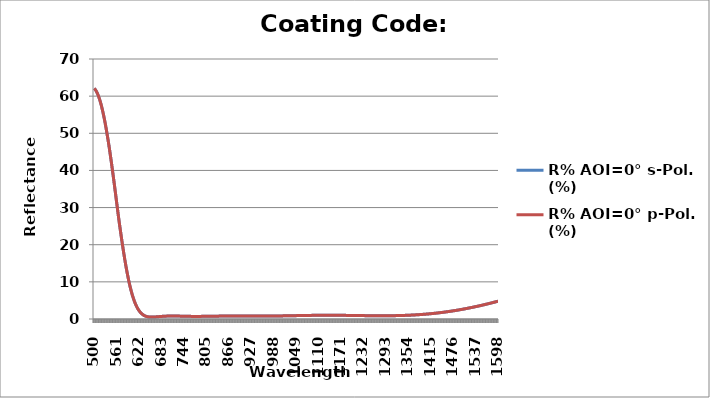
| Category | R% AOI=0° s-Pol. (%) | R% AOI=0° p-Pol. (%) |
|---|---|---|
| 500.0 | 62.076 | 62.076 |
| 501.0 | 61.985 | 61.985 |
| 502.0 | 61.878 | 61.878 |
| 503.0 | 61.754 | 61.754 |
| 504.0 | 61.613 | 61.613 |
| 505.0 | 61.457 | 61.457 |
| 506.0 | 61.284 | 61.284 |
| 507.0 | 61.096 | 61.096 |
| 508.0 | 60.893 | 60.893 |
| 509.0 | 60.674 | 60.674 |
| 510.0 | 60.44 | 60.44 |
| 511.0 | 60.19 | 60.19 |
| 512.0 | 59.926 | 59.926 |
| 513.0 | 59.647 | 59.647 |
| 514.0 | 59.353 | 59.353 |
| 515.0 | 59.044 | 59.044 |
| 516.0 | 58.72 | 58.72 |
| 517.0 | 58.379 | 58.379 |
| 518.0 | 58.023 | 58.023 |
| 519.0 | 57.653 | 57.653 |
| 520.0 | 57.268 | 57.268 |
| 521.0 | 56.869 | 56.869 |
| 522.0 | 56.456 | 56.456 |
| 523.0 | 56.029 | 56.029 |
| 524.0 | 55.587 | 55.587 |
| 525.0 | 55.132 | 55.132 |
| 526.0 | 54.663 | 54.663 |
| 527.0 | 54.18 | 54.18 |
| 528.0 | 53.684 | 53.684 |
| 529.0 | 53.175 | 53.175 |
| 530.0 | 52.652 | 52.652 |
| 531.0 | 52.116 | 52.116 |
| 532.0 | 51.566 | 51.566 |
| 533.0 | 51.005 | 51.005 |
| 534.0 | 50.43 | 50.43 |
| 535.0 | 49.843 | 49.843 |
| 536.0 | 49.244 | 49.244 |
| 537.0 | 48.638 | 48.638 |
| 538.0 | 48.02 | 48.02 |
| 539.0 | 47.392 | 47.392 |
| 540.0 | 46.752 | 46.752 |
| 541.0 | 46.101 | 46.101 |
| 542.0 | 45.44 | 45.44 |
| 543.0 | 44.768 | 44.768 |
| 544.0 | 44.087 | 44.087 |
| 545.0 | 43.397 | 43.397 |
| 546.0 | 42.697 | 42.697 |
| 547.0 | 41.989 | 41.989 |
| 548.0 | 41.272 | 41.272 |
| 549.0 | 40.548 | 40.548 |
| 550.0 | 39.817 | 39.817 |
| 551.0 | 39.079 | 39.079 |
| 552.0 | 38.336 | 38.336 |
| 553.0 | 37.586 | 37.586 |
| 554.0 | 36.832 | 36.832 |
| 555.0 | 36.071 | 36.071 |
| 556.0 | 35.306 | 35.306 |
| 557.0 | 34.537 | 34.537 |
| 558.0 | 33.766 | 33.766 |
| 559.0 | 32.993 | 32.993 |
| 560.0 | 32.218 | 32.218 |
| 561.0 | 31.443 | 31.443 |
| 562.0 | 30.668 | 30.668 |
| 563.0 | 29.893 | 29.893 |
| 564.0 | 29.12 | 29.12 |
| 565.0 | 28.348 | 28.348 |
| 566.0 | 27.579 | 27.579 |
| 567.0 | 26.832 | 26.832 |
| 568.0 | 26.116 | 26.116 |
| 569.0 | 25.403 | 25.403 |
| 570.0 | 24.695 | 24.695 |
| 571.0 | 23.992 | 23.992 |
| 572.0 | 23.294 | 23.294 |
| 573.0 | 22.604 | 22.604 |
| 574.0 | 21.919 | 21.919 |
| 575.0 | 21.242 | 21.242 |
| 576.0 | 20.573 | 20.573 |
| 577.0 | 19.912 | 19.912 |
| 578.0 | 19.26 | 19.26 |
| 579.0 | 18.617 | 18.617 |
| 580.0 | 17.984 | 17.984 |
| 581.0 | 17.36 | 17.36 |
| 582.0 | 16.747 | 16.747 |
| 583.0 | 16.145 | 16.145 |
| 584.0 | 15.554 | 15.554 |
| 585.0 | 14.974 | 14.974 |
| 586.0 | 14.406 | 14.406 |
| 587.0 | 13.85 | 13.85 |
| 588.0 | 13.306 | 13.306 |
| 589.0 | 12.774 | 12.774 |
| 590.0 | 12.256 | 12.256 |
| 591.0 | 11.749 | 11.749 |
| 592.0 | 11.256 | 11.256 |
| 593.0 | 10.776 | 10.776 |
| 594.0 | 10.308 | 10.308 |
| 595.0 | 9.854 | 9.854 |
| 596.0 | 9.414 | 9.414 |
| 597.0 | 8.986 | 8.986 |
| 598.0 | 8.571 | 8.571 |
| 599.0 | 8.17 | 8.17 |
| 600.0 | 7.782 | 7.782 |
| 601.0 | 7.407 | 7.407 |
| 602.0 | 7.044 | 7.044 |
| 603.0 | 6.695 | 6.695 |
| 604.0 | 6.358 | 6.358 |
| 605.0 | 6.034 | 6.034 |
| 606.0 | 5.722 | 5.722 |
| 607.0 | 5.422 | 5.422 |
| 608.0 | 5.135 | 5.135 |
| 609.0 | 4.859 | 4.859 |
| 610.0 | 4.594 | 4.594 |
| 611.0 | 4.341 | 4.341 |
| 612.0 | 4.1 | 4.1 |
| 613.0 | 3.869 | 3.869 |
| 614.0 | 3.648 | 3.648 |
| 615.0 | 3.438 | 3.438 |
| 616.0 | 3.238 | 3.238 |
| 617.0 | 3.048 | 3.048 |
| 618.0 | 2.868 | 2.868 |
| 619.0 | 2.697 | 2.697 |
| 620.0 | 2.534 | 2.534 |
| 621.0 | 2.381 | 2.381 |
| 622.0 | 2.236 | 2.236 |
| 623.0 | 2.099 | 2.099 |
| 624.0 | 1.97 | 1.97 |
| 625.0 | 1.848 | 1.848 |
| 626.0 | 1.734 | 1.734 |
| 627.0 | 1.627 | 1.627 |
| 628.0 | 1.527 | 1.527 |
| 629.0 | 1.433 | 1.433 |
| 630.0 | 1.346 | 1.346 |
| 631.0 | 1.264 | 1.264 |
| 632.0 | 1.188 | 1.188 |
| 633.0 | 1.118 | 1.118 |
| 634.0 | 1.052 | 1.052 |
| 635.0 | 0.993 | 0.993 |
| 636.0 | 0.937 | 0.937 |
| 637.0 | 0.887 | 0.887 |
| 638.0 | 0.84 | 0.84 |
| 639.0 | 0.798 | 0.798 |
| 640.0 | 0.759 | 0.759 |
| 641.0 | 0.724 | 0.724 |
| 642.0 | 0.692 | 0.692 |
| 643.0 | 0.664 | 0.664 |
| 644.0 | 0.638 | 0.638 |
| 645.0 | 0.616 | 0.616 |
| 646.0 | 0.596 | 0.596 |
| 647.0 | 0.578 | 0.578 |
| 648.0 | 0.564 | 0.564 |
| 649.0 | 0.551 | 0.551 |
| 650.0 | 0.54 | 0.54 |
| 651.0 | 0.531 | 0.531 |
| 652.0 | 0.524 | 0.524 |
| 653.0 | 0.519 | 0.519 |
| 654.0 | 0.516 | 0.516 |
| 655.0 | 0.513 | 0.513 |
| 656.0 | 0.512 | 0.512 |
| 657.0 | 0.512 | 0.512 |
| 658.0 | 0.514 | 0.514 |
| 659.0 | 0.516 | 0.516 |
| 660.0 | 0.52 | 0.52 |
| 661.0 | 0.524 | 0.524 |
| 662.0 | 0.528 | 0.528 |
| 663.0 | 0.534 | 0.534 |
| 664.0 | 0.54 | 0.54 |
| 665.0 | 0.547 | 0.547 |
| 666.0 | 0.554 | 0.554 |
| 667.0 | 0.561 | 0.561 |
| 668.0 | 0.569 | 0.569 |
| 669.0 | 0.577 | 0.577 |
| 670.0 | 0.585 | 0.585 |
| 671.0 | 0.594 | 0.594 |
| 672.0 | 0.602 | 0.602 |
| 673.0 | 0.611 | 0.611 |
| 674.0 | 0.62 | 0.62 |
| 675.0 | 0.628 | 0.628 |
| 676.0 | 0.637 | 0.637 |
| 677.0 | 0.646 | 0.646 |
| 678.0 | 0.654 | 0.654 |
| 679.0 | 0.662 | 0.662 |
| 680.0 | 0.671 | 0.671 |
| 681.0 | 0.679 | 0.679 |
| 682.0 | 0.687 | 0.687 |
| 683.0 | 0.694 | 0.694 |
| 684.0 | 0.702 | 0.702 |
| 685.0 | 0.709 | 0.709 |
| 686.0 | 0.716 | 0.716 |
| 687.0 | 0.723 | 0.723 |
| 688.0 | 0.73 | 0.73 |
| 689.0 | 0.736 | 0.736 |
| 690.0 | 0.742 | 0.742 |
| 691.0 | 0.748 | 0.748 |
| 692.0 | 0.753 | 0.753 |
| 693.0 | 0.758 | 0.758 |
| 694.0 | 0.763 | 0.763 |
| 695.0 | 0.768 | 0.768 |
| 696.0 | 0.772 | 0.772 |
| 697.0 | 0.776 | 0.776 |
| 698.0 | 0.779 | 0.779 |
| 699.0 | 0.783 | 0.783 |
| 700.0 | 0.786 | 0.786 |
| 701.0 | 0.789 | 0.789 |
| 702.0 | 0.792 | 0.792 |
| 703.0 | 0.794 | 0.794 |
| 704.0 | 0.796 | 0.796 |
| 705.0 | 0.798 | 0.798 |
| 706.0 | 0.799 | 0.799 |
| 707.0 | 0.801 | 0.801 |
| 708.0 | 0.802 | 0.802 |
| 709.0 | 0.803 | 0.803 |
| 710.0 | 0.803 | 0.803 |
| 711.0 | 0.804 | 0.804 |
| 712.0 | 0.804 | 0.804 |
| 713.0 | 0.804 | 0.804 |
| 714.0 | 0.804 | 0.804 |
| 715.0 | 0.804 | 0.804 |
| 716.0 | 0.803 | 0.803 |
| 717.0 | 0.803 | 0.803 |
| 718.0 | 0.802 | 0.802 |
| 719.0 | 0.801 | 0.801 |
| 720.0 | 0.8 | 0.8 |
| 721.0 | 0.798 | 0.798 |
| 722.0 | 0.796 | 0.796 |
| 723.0 | 0.795 | 0.795 |
| 724.0 | 0.793 | 0.793 |
| 725.0 | 0.791 | 0.791 |
| 726.0 | 0.789 | 0.789 |
| 727.0 | 0.787 | 0.787 |
| 728.0 | 0.785 | 0.785 |
| 729.0 | 0.783 | 0.783 |
| 730.0 | 0.78 | 0.78 |
| 731.0 | 0.778 | 0.778 |
| 732.0 | 0.776 | 0.776 |
| 733.0 | 0.774 | 0.774 |
| 734.0 | 0.771 | 0.771 |
| 735.0 | 0.768 | 0.768 |
| 736.0 | 0.765 | 0.765 |
| 737.0 | 0.762 | 0.762 |
| 738.0 | 0.76 | 0.76 |
| 739.0 | 0.757 | 0.757 |
| 740.0 | 0.754 | 0.754 |
| 741.0 | 0.751 | 0.751 |
| 742.0 | 0.749 | 0.749 |
| 743.0 | 0.746 | 0.746 |
| 744.0 | 0.744 | 0.744 |
| 745.0 | 0.741 | 0.741 |
| 746.0 | 0.738 | 0.738 |
| 747.0 | 0.736 | 0.736 |
| 748.0 | 0.734 | 0.734 |
| 749.0 | 0.731 | 0.731 |
| 750.0 | 0.729 | 0.729 |
| 751.0 | 0.727 | 0.727 |
| 752.0 | 0.725 | 0.725 |
| 753.0 | 0.723 | 0.723 |
| 754.0 | 0.721 | 0.721 |
| 755.0 | 0.719 | 0.719 |
| 756.0 | 0.717 | 0.717 |
| 757.0 | 0.715 | 0.715 |
| 758.0 | 0.714 | 0.714 |
| 759.0 | 0.712 | 0.712 |
| 760.0 | 0.711 | 0.711 |
| 761.0 | 0.709 | 0.709 |
| 762.0 | 0.708 | 0.708 |
| 763.0 | 0.707 | 0.707 |
| 764.0 | 0.706 | 0.706 |
| 765.0 | 0.704 | 0.704 |
| 766.0 | 0.704 | 0.704 |
| 767.0 | 0.703 | 0.703 |
| 768.0 | 0.702 | 0.702 |
| 769.0 | 0.701 | 0.701 |
| 770.0 | 0.701 | 0.701 |
| 771.0 | 0.7 | 0.7 |
| 772.0 | 0.7 | 0.7 |
| 773.0 | 0.699 | 0.699 |
| 774.0 | 0.699 | 0.699 |
| 775.0 | 0.699 | 0.699 |
| 776.0 | 0.699 | 0.699 |
| 777.0 | 0.699 | 0.699 |
| 778.0 | 0.699 | 0.699 |
| 779.0 | 0.699 | 0.699 |
| 780.0 | 0.699 | 0.699 |
| 781.0 | 0.699 | 0.699 |
| 782.0 | 0.7 | 0.7 |
| 783.0 | 0.7 | 0.7 |
| 784.0 | 0.701 | 0.701 |
| 785.0 | 0.701 | 0.701 |
| 786.0 | 0.702 | 0.702 |
| 787.0 | 0.702 | 0.702 |
| 788.0 | 0.703 | 0.703 |
| 789.0 | 0.704 | 0.704 |
| 790.0 | 0.705 | 0.705 |
| 791.0 | 0.706 | 0.706 |
| 792.0 | 0.707 | 0.707 |
| 793.0 | 0.708 | 0.708 |
| 794.0 | 0.709 | 0.709 |
| 795.0 | 0.71 | 0.71 |
| 796.0 | 0.711 | 0.711 |
| 797.0 | 0.712 | 0.712 |
| 798.0 | 0.713 | 0.713 |
| 799.0 | 0.714 | 0.714 |
| 800.0 | 0.716 | 0.716 |
| 801.0 | 0.717 | 0.717 |
| 802.0 | 0.719 | 0.719 |
| 803.0 | 0.72 | 0.72 |
| 804.0 | 0.722 | 0.722 |
| 805.0 | 0.723 | 0.723 |
| 806.0 | 0.725 | 0.725 |
| 807.0 | 0.726 | 0.726 |
| 808.0 | 0.728 | 0.728 |
| 809.0 | 0.729 | 0.729 |
| 810.0 | 0.731 | 0.731 |
| 811.0 | 0.732 | 0.732 |
| 812.0 | 0.734 | 0.734 |
| 813.0 | 0.736 | 0.736 |
| 814.0 | 0.737 | 0.737 |
| 815.0 | 0.739 | 0.739 |
| 816.0 | 0.741 | 0.741 |
| 817.0 | 0.742 | 0.742 |
| 818.0 | 0.744 | 0.744 |
| 819.0 | 0.745 | 0.745 |
| 820.0 | 0.747 | 0.747 |
| 821.0 | 0.749 | 0.749 |
| 822.0 | 0.75 | 0.75 |
| 823.0 | 0.752 | 0.752 |
| 824.0 | 0.753 | 0.753 |
| 825.0 | 0.755 | 0.755 |
| 826.0 | 0.756 | 0.756 |
| 827.0 | 0.758 | 0.758 |
| 828.0 | 0.759 | 0.759 |
| 829.0 | 0.761 | 0.761 |
| 830.0 | 0.762 | 0.762 |
| 831.0 | 0.764 | 0.764 |
| 832.0 | 0.765 | 0.765 |
| 833.0 | 0.767 | 0.767 |
| 834.0 | 0.768 | 0.768 |
| 835.0 | 0.769 | 0.769 |
| 836.0 | 0.77 | 0.77 |
| 837.0 | 0.772 | 0.772 |
| 838.0 | 0.773 | 0.773 |
| 839.0 | 0.774 | 0.774 |
| 840.0 | 0.775 | 0.775 |
| 841.0 | 0.776 | 0.776 |
| 842.0 | 0.777 | 0.777 |
| 843.0 | 0.778 | 0.778 |
| 844.0 | 0.779 | 0.779 |
| 845.0 | 0.78 | 0.78 |
| 846.0 | 0.781 | 0.781 |
| 847.0 | 0.782 | 0.782 |
| 848.0 | 0.783 | 0.783 |
| 849.0 | 0.784 | 0.784 |
| 850.0 | 0.784 | 0.784 |
| 851.0 | 0.785 | 0.785 |
| 852.0 | 0.786 | 0.786 |
| 853.0 | 0.786 | 0.786 |
| 854.0 | 0.787 | 0.787 |
| 855.0 | 0.788 | 0.788 |
| 856.0 | 0.788 | 0.788 |
| 857.0 | 0.789 | 0.789 |
| 858.0 | 0.79 | 0.79 |
| 859.0 | 0.79 | 0.79 |
| 860.0 | 0.79 | 0.79 |
| 861.0 | 0.791 | 0.791 |
| 862.0 | 0.791 | 0.791 |
| 863.0 | 0.792 | 0.792 |
| 864.0 | 0.792 | 0.792 |
| 865.0 | 0.792 | 0.792 |
| 866.0 | 0.792 | 0.792 |
| 867.0 | 0.793 | 0.793 |
| 868.0 | 0.793 | 0.793 |
| 869.0 | 0.793 | 0.793 |
| 870.0 | 0.793 | 0.793 |
| 871.0 | 0.793 | 0.793 |
| 872.0 | 0.794 | 0.794 |
| 873.0 | 0.794 | 0.794 |
| 874.0 | 0.794 | 0.794 |
| 875.0 | 0.794 | 0.794 |
| 876.0 | 0.794 | 0.794 |
| 877.0 | 0.794 | 0.794 |
| 878.0 | 0.794 | 0.794 |
| 879.0 | 0.794 | 0.794 |
| 880.0 | 0.794 | 0.794 |
| 881.0 | 0.794 | 0.794 |
| 882.0 | 0.794 | 0.794 |
| 883.0 | 0.793 | 0.793 |
| 884.0 | 0.793 | 0.793 |
| 885.0 | 0.793 | 0.793 |
| 886.0 | 0.793 | 0.793 |
| 887.0 | 0.793 | 0.793 |
| 888.0 | 0.793 | 0.793 |
| 889.0 | 0.792 | 0.792 |
| 890.0 | 0.792 | 0.792 |
| 891.0 | 0.792 | 0.792 |
| 892.0 | 0.792 | 0.792 |
| 893.0 | 0.792 | 0.792 |
| 894.0 | 0.791 | 0.791 |
| 895.0 | 0.791 | 0.791 |
| 896.0 | 0.791 | 0.791 |
| 897.0 | 0.79 | 0.79 |
| 898.0 | 0.79 | 0.79 |
| 899.0 | 0.79 | 0.79 |
| 900.0 | 0.789 | 0.789 |
| 901.0 | 0.789 | 0.789 |
| 902.0 | 0.789 | 0.789 |
| 903.0 | 0.788 | 0.788 |
| 904.0 | 0.788 | 0.788 |
| 905.0 | 0.788 | 0.788 |
| 906.0 | 0.787 | 0.787 |
| 907.0 | 0.787 | 0.787 |
| 908.0 | 0.786 | 0.786 |
| 909.0 | 0.786 | 0.786 |
| 910.0 | 0.786 | 0.786 |
| 911.0 | 0.785 | 0.785 |
| 912.0 | 0.785 | 0.785 |
| 913.0 | 0.784 | 0.784 |
| 914.0 | 0.784 | 0.784 |
| 915.0 | 0.784 | 0.784 |
| 916.0 | 0.783 | 0.783 |
| 917.0 | 0.783 | 0.783 |
| 918.0 | 0.782 | 0.782 |
| 919.0 | 0.782 | 0.782 |
| 920.0 | 0.782 | 0.782 |
| 921.0 | 0.781 | 0.781 |
| 922.0 | 0.781 | 0.781 |
| 923.0 | 0.781 | 0.781 |
| 924.0 | 0.78 | 0.78 |
| 925.0 | 0.78 | 0.78 |
| 926.0 | 0.78 | 0.78 |
| 927.0 | 0.78 | 0.78 |
| 928.0 | 0.779 | 0.779 |
| 929.0 | 0.779 | 0.779 |
| 930.0 | 0.779 | 0.779 |
| 931.0 | 0.779 | 0.779 |
| 932.0 | 0.778 | 0.778 |
| 933.0 | 0.778 | 0.778 |
| 934.0 | 0.778 | 0.778 |
| 935.0 | 0.778 | 0.778 |
| 936.0 | 0.778 | 0.778 |
| 937.0 | 0.778 | 0.778 |
| 938.0 | 0.778 | 0.778 |
| 939.0 | 0.778 | 0.778 |
| 940.0 | 0.778 | 0.778 |
| 941.0 | 0.778 | 0.778 |
| 942.0 | 0.778 | 0.778 |
| 943.0 | 0.778 | 0.778 |
| 944.0 | 0.778 | 0.778 |
| 945.0 | 0.778 | 0.778 |
| 946.0 | 0.778 | 0.778 |
| 947.0 | 0.778 | 0.778 |
| 948.0 | 0.778 | 0.778 |
| 949.0 | 0.778 | 0.778 |
| 950.0 | 0.778 | 0.778 |
| 951.0 | 0.778 | 0.778 |
| 952.0 | 0.779 | 0.779 |
| 953.0 | 0.779 | 0.779 |
| 954.0 | 0.779 | 0.779 |
| 955.0 | 0.78 | 0.78 |
| 956.0 | 0.78 | 0.78 |
| 957.0 | 0.78 | 0.78 |
| 958.0 | 0.781 | 0.781 |
| 959.0 | 0.781 | 0.781 |
| 960.0 | 0.782 | 0.782 |
| 961.0 | 0.782 | 0.782 |
| 962.0 | 0.783 | 0.783 |
| 963.0 | 0.783 | 0.783 |
| 964.0 | 0.784 | 0.784 |
| 965.0 | 0.784 | 0.784 |
| 966.0 | 0.785 | 0.785 |
| 967.0 | 0.786 | 0.786 |
| 968.0 | 0.786 | 0.786 |
| 969.0 | 0.787 | 0.787 |
| 970.0 | 0.788 | 0.788 |
| 971.0 | 0.788 | 0.788 |
| 972.0 | 0.789 | 0.789 |
| 973.0 | 0.79 | 0.79 |
| 974.0 | 0.791 | 0.791 |
| 975.0 | 0.792 | 0.792 |
| 976.0 | 0.792 | 0.792 |
| 977.0 | 0.793 | 0.793 |
| 978.0 | 0.794 | 0.794 |
| 979.0 | 0.795 | 0.795 |
| 980.0 | 0.796 | 0.796 |
| 981.0 | 0.797 | 0.797 |
| 982.0 | 0.798 | 0.798 |
| 983.0 | 0.8 | 0.8 |
| 984.0 | 0.801 | 0.801 |
| 985.0 | 0.802 | 0.802 |
| 986.0 | 0.803 | 0.803 |
| 987.0 | 0.804 | 0.804 |
| 988.0 | 0.805 | 0.805 |
| 989.0 | 0.806 | 0.806 |
| 990.0 | 0.808 | 0.808 |
| 991.0 | 0.809 | 0.809 |
| 992.0 | 0.81 | 0.81 |
| 993.0 | 0.812 | 0.812 |
| 994.0 | 0.813 | 0.813 |
| 995.0 | 0.814 | 0.814 |
| 996.0 | 0.816 | 0.816 |
| 997.0 | 0.817 | 0.817 |
| 998.0 | 0.818 | 0.818 |
| 999.0 | 0.82 | 0.82 |
| 1000.0 | 0.821 | 0.821 |
| 1001.0 | 0.822 | 0.822 |
| 1002.0 | 0.824 | 0.824 |
| 1003.0 | 0.825 | 0.825 |
| 1004.0 | 0.827 | 0.827 |
| 1005.0 | 0.828 | 0.828 |
| 1006.0 | 0.83 | 0.83 |
| 1007.0 | 0.831 | 0.831 |
| 1008.0 | 0.833 | 0.833 |
| 1009.0 | 0.834 | 0.834 |
| 1010.0 | 0.836 | 0.836 |
| 1011.0 | 0.838 | 0.838 |
| 1012.0 | 0.839 | 0.839 |
| 1013.0 | 0.841 | 0.841 |
| 1014.0 | 0.843 | 0.843 |
| 1015.0 | 0.844 | 0.844 |
| 1016.0 | 0.846 | 0.846 |
| 1017.0 | 0.848 | 0.848 |
| 1018.0 | 0.849 | 0.849 |
| 1019.0 | 0.851 | 0.851 |
| 1020.0 | 0.853 | 0.853 |
| 1021.0 | 0.855 | 0.855 |
| 1022.0 | 0.856 | 0.856 |
| 1023.0 | 0.858 | 0.858 |
| 1024.0 | 0.86 | 0.86 |
| 1025.0 | 0.862 | 0.862 |
| 1026.0 | 0.864 | 0.864 |
| 1027.0 | 0.865 | 0.865 |
| 1028.0 | 0.867 | 0.867 |
| 1029.0 | 0.869 | 0.869 |
| 1030.0 | 0.871 | 0.871 |
| 1031.0 | 0.873 | 0.873 |
| 1032.0 | 0.874 | 0.874 |
| 1033.0 | 0.876 | 0.876 |
| 1034.0 | 0.878 | 0.878 |
| 1035.0 | 0.88 | 0.88 |
| 1036.0 | 0.882 | 0.882 |
| 1037.0 | 0.884 | 0.884 |
| 1038.0 | 0.886 | 0.886 |
| 1039.0 | 0.888 | 0.888 |
| 1040.0 | 0.89 | 0.89 |
| 1041.0 | 0.891 | 0.891 |
| 1042.0 | 0.893 | 0.893 |
| 1043.0 | 0.895 | 0.895 |
| 1044.0 | 0.897 | 0.897 |
| 1045.0 | 0.899 | 0.899 |
| 1046.0 | 0.901 | 0.901 |
| 1047.0 | 0.903 | 0.903 |
| 1048.0 | 0.904 | 0.904 |
| 1049.0 | 0.906 | 0.906 |
| 1050.0 | 0.908 | 0.908 |
| 1051.0 | 0.91 | 0.91 |
| 1052.0 | 0.912 | 0.912 |
| 1053.0 | 0.914 | 0.914 |
| 1054.0 | 0.916 | 0.916 |
| 1055.0 | 0.918 | 0.918 |
| 1056.0 | 0.919 | 0.919 |
| 1057.0 | 0.921 | 0.921 |
| 1058.0 | 0.923 | 0.923 |
| 1059.0 | 0.925 | 0.925 |
| 1060.0 | 0.926 | 0.926 |
| 1061.0 | 0.928 | 0.928 |
| 1062.0 | 0.93 | 0.93 |
| 1063.0 | 0.932 | 0.932 |
| 1064.0 | 0.934 | 0.934 |
| 1065.0 | 0.935 | 0.935 |
| 1066.0 | 0.937 | 0.937 |
| 1067.0 | 0.939 | 0.939 |
| 1068.0 | 0.94 | 0.94 |
| 1069.0 | 0.942 | 0.942 |
| 1070.0 | 0.944 | 0.944 |
| 1071.0 | 0.946 | 0.946 |
| 1072.0 | 0.947 | 0.947 |
| 1073.0 | 0.949 | 0.949 |
| 1074.0 | 0.95 | 0.95 |
| 1075.0 | 0.952 | 0.952 |
| 1076.0 | 0.954 | 0.954 |
| 1077.0 | 0.955 | 0.955 |
| 1078.0 | 0.957 | 0.957 |
| 1079.0 | 0.958 | 0.958 |
| 1080.0 | 0.96 | 0.96 |
| 1081.0 | 0.961 | 0.961 |
| 1082.0 | 0.963 | 0.963 |
| 1083.0 | 0.964 | 0.964 |
| 1084.0 | 0.966 | 0.966 |
| 1085.0 | 0.967 | 0.967 |
| 1086.0 | 0.969 | 0.969 |
| 1087.0 | 0.97 | 0.97 |
| 1088.0 | 0.971 | 0.971 |
| 1089.0 | 0.973 | 0.973 |
| 1090.0 | 0.974 | 0.974 |
| 1091.0 | 0.975 | 0.975 |
| 1092.0 | 0.976 | 0.976 |
| 1093.0 | 0.978 | 0.978 |
| 1094.0 | 0.979 | 0.979 |
| 1095.0 | 0.98 | 0.98 |
| 1096.0 | 0.981 | 0.981 |
| 1097.0 | 0.982 | 0.982 |
| 1098.0 | 0.984 | 0.984 |
| 1099.0 | 0.985 | 0.985 |
| 1100.0 | 0.986 | 0.986 |
| 1101.0 | 0.987 | 0.987 |
| 1102.0 | 0.988 | 0.988 |
| 1103.0 | 0.989 | 0.989 |
| 1104.0 | 0.99 | 0.99 |
| 1105.0 | 0.99 | 0.99 |
| 1106.0 | 0.991 | 0.991 |
| 1107.0 | 0.992 | 0.992 |
| 1108.0 | 0.993 | 0.993 |
| 1109.0 | 0.994 | 0.994 |
| 1110.0 | 0.995 | 0.995 |
| 1111.0 | 0.996 | 0.996 |
| 1112.0 | 0.996 | 0.996 |
| 1113.0 | 0.997 | 0.997 |
| 1114.0 | 0.998 | 0.998 |
| 1115.0 | 0.998 | 0.998 |
| 1116.0 | 0.999 | 0.999 |
| 1117.0 | 1 | 1 |
| 1118.0 | 1 | 1 |
| 1119.0 | 1.001 | 1.001 |
| 1120.0 | 1.001 | 1.001 |
| 1121.0 | 1.002 | 1.002 |
| 1122.0 | 1.002 | 1.002 |
| 1123.0 | 1.002 | 1.002 |
| 1124.0 | 1.003 | 1.003 |
| 1125.0 | 1.003 | 1.003 |
| 1126.0 | 1.004 | 1.004 |
| 1127.0 | 1.004 | 1.004 |
| 1128.0 | 1.004 | 1.004 |
| 1129.0 | 1.004 | 1.004 |
| 1130.0 | 1.004 | 1.004 |
| 1131.0 | 1.005 | 1.005 |
| 1132.0 | 1.005 | 1.005 |
| 1133.0 | 1.005 | 1.005 |
| 1134.0 | 1.005 | 1.005 |
| 1135.0 | 1.005 | 1.005 |
| 1136.0 | 1.005 | 1.005 |
| 1137.0 | 1.005 | 1.005 |
| 1138.0 | 1.005 | 1.005 |
| 1139.0 | 1.005 | 1.005 |
| 1140.0 | 1.005 | 1.005 |
| 1141.0 | 1.005 | 1.005 |
| 1142.0 | 1.005 | 1.005 |
| 1143.0 | 1.005 | 1.005 |
| 1144.0 | 1.004 | 1.004 |
| 1145.0 | 1.004 | 1.004 |
| 1146.0 | 1.004 | 1.004 |
| 1147.0 | 1.004 | 1.004 |
| 1148.0 | 1.003 | 1.003 |
| 1149.0 | 1.003 | 1.003 |
| 1150.0 | 1.003 | 1.003 |
| 1151.0 | 1.002 | 1.002 |
| 1152.0 | 1.002 | 1.002 |
| 1153.0 | 1.002 | 1.002 |
| 1154.0 | 1.001 | 1.001 |
| 1155.0 | 1.001 | 1.001 |
| 1156.0 | 1 | 1 |
| 1157.0 | 1 | 1 |
| 1158.0 | 0.999 | 0.999 |
| 1159.0 | 0.998 | 0.998 |
| 1160.0 | 0.998 | 0.998 |
| 1161.0 | 0.997 | 0.997 |
| 1162.0 | 0.996 | 0.996 |
| 1163.0 | 0.996 | 0.996 |
| 1164.0 | 0.995 | 0.995 |
| 1165.0 | 0.994 | 0.994 |
| 1166.0 | 0.994 | 0.994 |
| 1167.0 | 0.993 | 0.993 |
| 1168.0 | 0.992 | 0.992 |
| 1169.0 | 0.991 | 0.991 |
| 1170.0 | 0.99 | 0.99 |
| 1171.0 | 0.989 | 0.989 |
| 1172.0 | 0.988 | 0.988 |
| 1173.0 | 0.988 | 0.988 |
| 1174.0 | 0.987 | 0.987 |
| 1175.0 | 0.986 | 0.986 |
| 1176.0 | 0.985 | 0.985 |
| 1177.0 | 0.984 | 0.984 |
| 1178.0 | 0.983 | 0.983 |
| 1179.0 | 0.982 | 0.982 |
| 1180.0 | 0.981 | 0.981 |
| 1181.0 | 0.98 | 0.98 |
| 1182.0 | 0.978 | 0.978 |
| 1183.0 | 0.977 | 0.977 |
| 1184.0 | 0.976 | 0.976 |
| 1185.0 | 0.975 | 0.975 |
| 1186.0 | 0.974 | 0.974 |
| 1187.0 | 0.973 | 0.973 |
| 1188.0 | 0.972 | 0.972 |
| 1189.0 | 0.97 | 0.97 |
| 1190.0 | 0.969 | 0.969 |
| 1191.0 | 0.968 | 0.968 |
| 1192.0 | 0.967 | 0.967 |
| 1193.0 | 0.966 | 0.966 |
| 1194.0 | 0.964 | 0.964 |
| 1195.0 | 0.963 | 0.963 |
| 1196.0 | 0.962 | 0.962 |
| 1197.0 | 0.96 | 0.96 |
| 1198.0 | 0.959 | 0.959 |
| 1199.0 | 0.958 | 0.958 |
| 1200.0 | 0.956 | 0.956 |
| 1201.0 | 0.955 | 0.955 |
| 1202.0 | 0.954 | 0.954 |
| 1203.0 | 0.952 | 0.952 |
| 1204.0 | 0.951 | 0.951 |
| 1205.0 | 0.95 | 0.95 |
| 1206.0 | 0.948 | 0.948 |
| 1207.0 | 0.947 | 0.947 |
| 1208.0 | 0.946 | 0.946 |
| 1209.0 | 0.944 | 0.944 |
| 1210.0 | 0.943 | 0.943 |
| 1211.0 | 0.941 | 0.941 |
| 1212.0 | 0.94 | 0.94 |
| 1213.0 | 0.939 | 0.939 |
| 1214.0 | 0.937 | 0.937 |
| 1215.0 | 0.936 | 0.936 |
| 1216.0 | 0.934 | 0.934 |
| 1217.0 | 0.933 | 0.933 |
| 1218.0 | 0.932 | 0.932 |
| 1219.0 | 0.93 | 0.93 |
| 1220.0 | 0.929 | 0.929 |
| 1221.0 | 0.927 | 0.927 |
| 1222.0 | 0.926 | 0.926 |
| 1223.0 | 0.925 | 0.925 |
| 1224.0 | 0.923 | 0.923 |
| 1225.0 | 0.922 | 0.922 |
| 1226.0 | 0.92 | 0.92 |
| 1227.0 | 0.919 | 0.919 |
| 1228.0 | 0.918 | 0.918 |
| 1229.0 | 0.916 | 0.916 |
| 1230.0 | 0.915 | 0.915 |
| 1231.0 | 0.914 | 0.914 |
| 1232.0 | 0.912 | 0.912 |
| 1233.0 | 0.911 | 0.911 |
| 1234.0 | 0.91 | 0.91 |
| 1235.0 | 0.908 | 0.908 |
| 1236.0 | 0.907 | 0.907 |
| 1237.0 | 0.906 | 0.906 |
| 1238.0 | 0.905 | 0.905 |
| 1239.0 | 0.904 | 0.904 |
| 1240.0 | 0.902 | 0.902 |
| 1241.0 | 0.901 | 0.901 |
| 1242.0 | 0.9 | 0.9 |
| 1243.0 | 0.899 | 0.899 |
| 1244.0 | 0.898 | 0.898 |
| 1245.0 | 0.897 | 0.897 |
| 1246.0 | 0.896 | 0.896 |
| 1247.0 | 0.895 | 0.895 |
| 1248.0 | 0.894 | 0.894 |
| 1249.0 | 0.893 | 0.893 |
| 1250.0 | 0.892 | 0.892 |
| 1251.0 | 0.891 | 0.891 |
| 1252.0 | 0.89 | 0.89 |
| 1253.0 | 0.889 | 0.889 |
| 1254.0 | 0.888 | 0.888 |
| 1255.0 | 0.887 | 0.887 |
| 1256.0 | 0.886 | 0.886 |
| 1257.0 | 0.886 | 0.886 |
| 1258.0 | 0.885 | 0.885 |
| 1259.0 | 0.884 | 0.884 |
| 1260.0 | 0.883 | 0.883 |
| 1261.0 | 0.883 | 0.883 |
| 1262.0 | 0.882 | 0.882 |
| 1263.0 | 0.881 | 0.881 |
| 1264.0 | 0.881 | 0.881 |
| 1265.0 | 0.88 | 0.88 |
| 1266.0 | 0.88 | 0.88 |
| 1267.0 | 0.879 | 0.879 |
| 1268.0 | 0.878 | 0.878 |
| 1269.0 | 0.878 | 0.878 |
| 1270.0 | 0.878 | 0.878 |
| 1271.0 | 0.877 | 0.877 |
| 1272.0 | 0.877 | 0.877 |
| 1273.0 | 0.876 | 0.876 |
| 1274.0 | 0.876 | 0.876 |
| 1275.0 | 0.876 | 0.876 |
| 1276.0 | 0.876 | 0.876 |
| 1277.0 | 0.875 | 0.875 |
| 1278.0 | 0.875 | 0.875 |
| 1279.0 | 0.875 | 0.875 |
| 1280.0 | 0.875 | 0.875 |
| 1281.0 | 0.875 | 0.875 |
| 1282.0 | 0.875 | 0.875 |
| 1283.0 | 0.875 | 0.875 |
| 1284.0 | 0.875 | 0.875 |
| 1285.0 | 0.875 | 0.875 |
| 1286.0 | 0.875 | 0.875 |
| 1287.0 | 0.875 | 0.875 |
| 1288.0 | 0.875 | 0.875 |
| 1289.0 | 0.876 | 0.876 |
| 1290.0 | 0.876 | 0.876 |
| 1291.0 | 0.876 | 0.876 |
| 1292.0 | 0.877 | 0.877 |
| 1293.0 | 0.877 | 0.877 |
| 1294.0 | 0.878 | 0.878 |
| 1295.0 | 0.878 | 0.878 |
| 1296.0 | 0.879 | 0.879 |
| 1297.0 | 0.879 | 0.879 |
| 1298.0 | 0.88 | 0.88 |
| 1299.0 | 0.881 | 0.881 |
| 1300.0 | 0.881 | 0.881 |
| 1301.0 | 0.882 | 0.882 |
| 1302.0 | 0.883 | 0.883 |
| 1303.0 | 0.884 | 0.884 |
| 1304.0 | 0.885 | 0.885 |
| 1305.0 | 0.886 | 0.886 |
| 1306.0 | 0.887 | 0.887 |
| 1307.0 | 0.888 | 0.888 |
| 1308.0 | 0.889 | 0.889 |
| 1309.0 | 0.891 | 0.891 |
| 1310.0 | 0.892 | 0.892 |
| 1311.0 | 0.893 | 0.893 |
| 1312.0 | 0.895 | 0.895 |
| 1313.0 | 0.896 | 0.896 |
| 1314.0 | 0.898 | 0.898 |
| 1315.0 | 0.899 | 0.899 |
| 1316.0 | 0.901 | 0.901 |
| 1317.0 | 0.903 | 0.903 |
| 1318.0 | 0.904 | 0.904 |
| 1319.0 | 0.906 | 0.906 |
| 1320.0 | 0.908 | 0.908 |
| 1321.0 | 0.91 | 0.91 |
| 1322.0 | 0.912 | 0.912 |
| 1323.0 | 0.914 | 0.914 |
| 1324.0 | 0.916 | 0.916 |
| 1325.0 | 0.918 | 0.918 |
| 1326.0 | 0.921 | 0.921 |
| 1327.0 | 0.923 | 0.923 |
| 1328.0 | 0.925 | 0.925 |
| 1329.0 | 0.928 | 0.928 |
| 1330.0 | 0.93 | 0.93 |
| 1331.0 | 0.933 | 0.933 |
| 1332.0 | 0.935 | 0.935 |
| 1333.0 | 0.938 | 0.938 |
| 1334.0 | 0.941 | 0.941 |
| 1335.0 | 0.944 | 0.944 |
| 1336.0 | 0.947 | 0.947 |
| 1337.0 | 0.95 | 0.95 |
| 1338.0 | 0.953 | 0.953 |
| 1339.0 | 0.956 | 0.956 |
| 1340.0 | 0.959 | 0.959 |
| 1341.0 | 0.962 | 0.962 |
| 1342.0 | 0.966 | 0.966 |
| 1343.0 | 0.969 | 0.969 |
| 1344.0 | 0.972 | 0.972 |
| 1345.0 | 0.976 | 0.976 |
| 1346.0 | 0.98 | 0.98 |
| 1347.0 | 0.983 | 0.983 |
| 1348.0 | 0.987 | 0.987 |
| 1349.0 | 0.991 | 0.991 |
| 1350.0 | 0.995 | 0.995 |
| 1351.0 | 0.999 | 0.999 |
| 1352.0 | 1.003 | 1.003 |
| 1353.0 | 1.007 | 1.007 |
| 1354.0 | 1.011 | 1.011 |
| 1355.0 | 1.016 | 1.016 |
| 1356.0 | 1.02 | 1.02 |
| 1357.0 | 1.024 | 1.024 |
| 1358.0 | 1.029 | 1.029 |
| 1359.0 | 1.033 | 1.033 |
| 1360.0 | 1.038 | 1.038 |
| 1361.0 | 1.043 | 1.043 |
| 1362.0 | 1.048 | 1.048 |
| 1363.0 | 1.053 | 1.053 |
| 1364.0 | 1.058 | 1.058 |
| 1365.0 | 1.063 | 1.063 |
| 1366.0 | 1.068 | 1.068 |
| 1367.0 | 1.073 | 1.073 |
| 1368.0 | 1.078 | 1.078 |
| 1369.0 | 1.084 | 1.084 |
| 1370.0 | 1.089 | 1.089 |
| 1371.0 | 1.095 | 1.095 |
| 1372.0 | 1.101 | 1.101 |
| 1373.0 | 1.106 | 1.106 |
| 1374.0 | 1.112 | 1.112 |
| 1375.0 | 1.118 | 1.118 |
| 1376.0 | 1.124 | 1.124 |
| 1377.0 | 1.13 | 1.13 |
| 1378.0 | 1.136 | 1.136 |
| 1379.0 | 1.143 | 1.143 |
| 1380.0 | 1.149 | 1.149 |
| 1381.0 | 1.156 | 1.156 |
| 1382.0 | 1.162 | 1.162 |
| 1383.0 | 1.169 | 1.169 |
| 1384.0 | 1.175 | 1.175 |
| 1385.0 | 1.182 | 1.182 |
| 1386.0 | 1.189 | 1.189 |
| 1387.0 | 1.196 | 1.196 |
| 1388.0 | 1.203 | 1.203 |
| 1389.0 | 1.21 | 1.21 |
| 1390.0 | 1.217 | 1.217 |
| 1391.0 | 1.225 | 1.225 |
| 1392.0 | 1.232 | 1.232 |
| 1393.0 | 1.24 | 1.24 |
| 1394.0 | 1.247 | 1.247 |
| 1395.0 | 1.255 | 1.255 |
| 1396.0 | 1.263 | 1.263 |
| 1397.0 | 1.271 | 1.271 |
| 1398.0 | 1.279 | 1.279 |
| 1399.0 | 1.287 | 1.287 |
| 1400.0 | 1.295 | 1.295 |
| 1401.0 | 1.303 | 1.303 |
| 1402.0 | 1.311 | 1.311 |
| 1403.0 | 1.32 | 1.32 |
| 1404.0 | 1.328 | 1.328 |
| 1405.0 | 1.337 | 1.337 |
| 1406.0 | 1.346 | 1.346 |
| 1407.0 | 1.354 | 1.354 |
| 1408.0 | 1.363 | 1.363 |
| 1409.0 | 1.372 | 1.372 |
| 1410.0 | 1.381 | 1.381 |
| 1411.0 | 1.39 | 1.39 |
| 1412.0 | 1.4 | 1.4 |
| 1413.0 | 1.409 | 1.409 |
| 1414.0 | 1.419 | 1.419 |
| 1415.0 | 1.428 | 1.428 |
| 1416.0 | 1.438 | 1.438 |
| 1417.0 | 1.448 | 1.448 |
| 1418.0 | 1.457 | 1.457 |
| 1419.0 | 1.467 | 1.467 |
| 1420.0 | 1.477 | 1.477 |
| 1421.0 | 1.487 | 1.487 |
| 1422.0 | 1.498 | 1.498 |
| 1423.0 | 1.508 | 1.508 |
| 1424.0 | 1.518 | 1.518 |
| 1425.0 | 1.529 | 1.529 |
| 1426.0 | 1.54 | 1.54 |
| 1427.0 | 1.55 | 1.55 |
| 1428.0 | 1.561 | 1.561 |
| 1429.0 | 1.572 | 1.572 |
| 1430.0 | 1.583 | 1.583 |
| 1431.0 | 1.594 | 1.594 |
| 1432.0 | 1.605 | 1.605 |
| 1433.0 | 1.617 | 1.617 |
| 1434.0 | 1.628 | 1.628 |
| 1435.0 | 1.64 | 1.64 |
| 1436.0 | 1.651 | 1.651 |
| 1437.0 | 1.663 | 1.663 |
| 1438.0 | 1.674 | 1.674 |
| 1439.0 | 1.686 | 1.686 |
| 1440.0 | 1.698 | 1.698 |
| 1441.0 | 1.71 | 1.71 |
| 1442.0 | 1.723 | 1.723 |
| 1443.0 | 1.735 | 1.735 |
| 1444.0 | 1.747 | 1.747 |
| 1445.0 | 1.76 | 1.76 |
| 1446.0 | 1.772 | 1.772 |
| 1447.0 | 1.785 | 1.785 |
| 1448.0 | 1.798 | 1.798 |
| 1449.0 | 1.811 | 1.811 |
| 1450.0 | 1.824 | 1.824 |
| 1451.0 | 1.837 | 1.837 |
| 1452.0 | 1.85 | 1.85 |
| 1453.0 | 1.863 | 1.863 |
| 1454.0 | 1.877 | 1.877 |
| 1455.0 | 1.89 | 1.89 |
| 1456.0 | 1.904 | 1.904 |
| 1457.0 | 1.917 | 1.917 |
| 1458.0 | 1.931 | 1.931 |
| 1459.0 | 1.945 | 1.945 |
| 1460.0 | 1.959 | 1.959 |
| 1461.0 | 1.973 | 1.973 |
| 1462.0 | 1.987 | 1.987 |
| 1463.0 | 2.001 | 2.001 |
| 1464.0 | 2.016 | 2.016 |
| 1465.0 | 2.03 | 2.03 |
| 1466.0 | 2.045 | 2.045 |
| 1467.0 | 2.06 | 2.06 |
| 1468.0 | 2.074 | 2.074 |
| 1469.0 | 2.089 | 2.089 |
| 1470.0 | 2.104 | 2.104 |
| 1471.0 | 2.119 | 2.119 |
| 1472.0 | 2.134 | 2.134 |
| 1473.0 | 2.15 | 2.15 |
| 1474.0 | 2.165 | 2.165 |
| 1475.0 | 2.18 | 2.18 |
| 1476.0 | 2.196 | 2.196 |
| 1477.0 | 2.212 | 2.212 |
| 1478.0 | 2.227 | 2.227 |
| 1479.0 | 2.243 | 2.243 |
| 1480.0 | 2.259 | 2.259 |
| 1481.0 | 2.275 | 2.275 |
| 1482.0 | 2.291 | 2.291 |
| 1483.0 | 2.308 | 2.308 |
| 1484.0 | 2.324 | 2.324 |
| 1485.0 | 2.34 | 2.34 |
| 1486.0 | 2.357 | 2.357 |
| 1487.0 | 2.374 | 2.374 |
| 1488.0 | 2.39 | 2.39 |
| 1489.0 | 2.407 | 2.407 |
| 1490.0 | 2.424 | 2.424 |
| 1491.0 | 2.441 | 2.441 |
| 1492.0 | 2.458 | 2.458 |
| 1493.0 | 2.476 | 2.476 |
| 1494.0 | 2.493 | 2.493 |
| 1495.0 | 2.51 | 2.51 |
| 1496.0 | 2.528 | 2.528 |
| 1497.0 | 2.545 | 2.545 |
| 1498.0 | 2.563 | 2.563 |
| 1499.0 | 2.581 | 2.581 |
| 1500.0 | 2.599 | 2.599 |
| 1501.0 | 2.617 | 2.617 |
| 1502.0 | 2.635 | 2.635 |
| 1503.0 | 2.653 | 2.653 |
| 1504.0 | 2.671 | 2.671 |
| 1505.0 | 2.69 | 2.69 |
| 1506.0 | 2.708 | 2.708 |
| 1507.0 | 2.727 | 2.727 |
| 1508.0 | 2.746 | 2.746 |
| 1509.0 | 2.764 | 2.764 |
| 1510.0 | 2.783 | 2.783 |
| 1511.0 | 2.802 | 2.802 |
| 1512.0 | 2.821 | 2.821 |
| 1513.0 | 2.84 | 2.84 |
| 1514.0 | 2.86 | 2.86 |
| 1515.0 | 2.879 | 2.879 |
| 1516.0 | 2.898 | 2.898 |
| 1517.0 | 2.918 | 2.918 |
| 1518.0 | 2.937 | 2.937 |
| 1519.0 | 2.957 | 2.957 |
| 1520.0 | 2.977 | 2.977 |
| 1521.0 | 2.997 | 2.997 |
| 1522.0 | 3.017 | 3.017 |
| 1523.0 | 3.037 | 3.037 |
| 1524.0 | 3.057 | 3.057 |
| 1525.0 | 3.077 | 3.077 |
| 1526.0 | 3.098 | 3.098 |
| 1527.0 | 3.118 | 3.118 |
| 1528.0 | 3.139 | 3.139 |
| 1529.0 | 3.159 | 3.159 |
| 1530.0 | 3.18 | 3.18 |
| 1531.0 | 3.201 | 3.201 |
| 1532.0 | 3.222 | 3.222 |
| 1533.0 | 3.243 | 3.243 |
| 1534.0 | 3.264 | 3.264 |
| 1535.0 | 3.285 | 3.285 |
| 1536.0 | 3.306 | 3.306 |
| 1537.0 | 3.328 | 3.328 |
| 1538.0 | 3.349 | 3.349 |
| 1539.0 | 3.37 | 3.37 |
| 1540.0 | 3.392 | 3.392 |
| 1541.0 | 3.414 | 3.414 |
| 1542.0 | 3.436 | 3.436 |
| 1543.0 | 3.458 | 3.458 |
| 1544.0 | 3.479 | 3.479 |
| 1545.0 | 3.502 | 3.502 |
| 1546.0 | 3.524 | 3.524 |
| 1547.0 | 3.546 | 3.546 |
| 1548.0 | 3.568 | 3.568 |
| 1549.0 | 3.591 | 3.591 |
| 1550.0 | 3.613 | 3.613 |
| 1551.0 | 3.636 | 3.636 |
| 1552.0 | 3.659 | 3.659 |
| 1553.0 | 3.682 | 3.682 |
| 1554.0 | 3.704 | 3.704 |
| 1555.0 | 3.728 | 3.728 |
| 1556.0 | 3.751 | 3.751 |
| 1557.0 | 3.774 | 3.774 |
| 1558.0 | 3.797 | 3.797 |
| 1559.0 | 3.821 | 3.821 |
| 1560.0 | 3.844 | 3.844 |
| 1561.0 | 3.868 | 3.868 |
| 1562.0 | 3.892 | 3.892 |
| 1563.0 | 3.915 | 3.915 |
| 1564.0 | 3.939 | 3.939 |
| 1565.0 | 3.963 | 3.963 |
| 1566.0 | 3.987 | 3.987 |
| 1567.0 | 4.011 | 4.011 |
| 1568.0 | 4.035 | 4.035 |
| 1569.0 | 4.06 | 4.06 |
| 1570.0 | 4.084 | 4.084 |
| 1571.0 | 4.108 | 4.108 |
| 1572.0 | 4.133 | 4.133 |
| 1573.0 | 4.157 | 4.157 |
| 1574.0 | 4.182 | 4.182 |
| 1575.0 | 4.207 | 4.207 |
| 1576.0 | 4.231 | 4.231 |
| 1577.0 | 4.256 | 4.256 |
| 1578.0 | 4.281 | 4.281 |
| 1579.0 | 4.306 | 4.306 |
| 1580.0 | 4.331 | 4.331 |
| 1581.0 | 4.357 | 4.357 |
| 1582.0 | 4.382 | 4.382 |
| 1583.0 | 4.407 | 4.407 |
| 1584.0 | 4.433 | 4.433 |
| 1585.0 | 4.458 | 4.458 |
| 1586.0 | 4.484 | 4.484 |
| 1587.0 | 4.509 | 4.509 |
| 1588.0 | 4.535 | 4.535 |
| 1589.0 | 4.561 | 4.561 |
| 1590.0 | 4.587 | 4.587 |
| 1591.0 | 4.613 | 4.613 |
| 1592.0 | 4.639 | 4.639 |
| 1593.0 | 4.665 | 4.665 |
| 1594.0 | 4.691 | 4.691 |
| 1595.0 | 4.717 | 4.717 |
| 1596.0 | 4.744 | 4.744 |
| 1597.0 | 4.77 | 4.77 |
| 1598.0 | 4.796 | 4.796 |
| 1599.0 | 4.823 | 4.823 |
| 1600.0 | 4.85 | 4.85 |